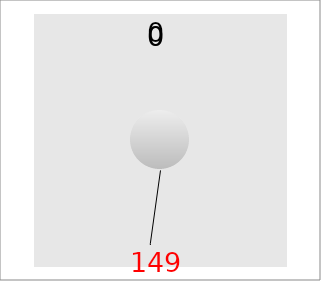
| Category | Прибыль |
|---|---|
| 0 | 56 |
| 1 | 6 |
| 2 | 46 |
| 3 | 41 |